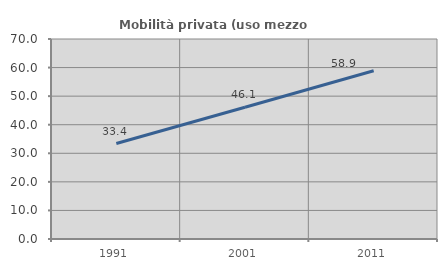
| Category | Mobilità privata (uso mezzo privato) |
|---|---|
| 1991.0 | 33.421 |
| 2001.0 | 46.129 |
| 2011.0 | 58.904 |